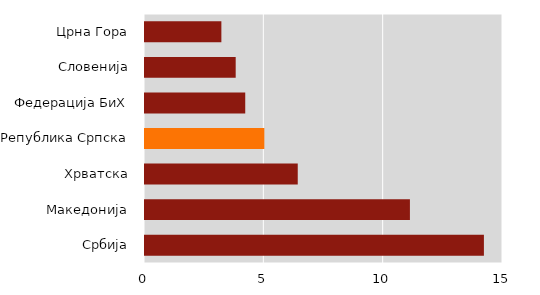
| Category | Series 1 |
|---|---|
| Србија | 14.2 |
| Македонија | 11.1 |
| Хрватска | 6.4 |
| Република Српска | 5 |
| Федерација БиХ | 4.2 |
| Словенија | 3.8 |
| Црна Гора | 3.2 |